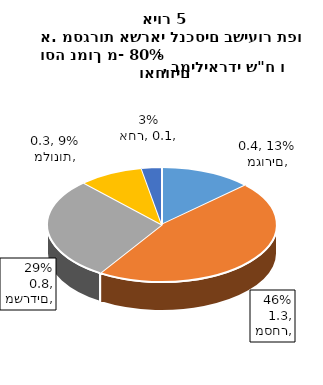
| Category | Series 0 |
|---|---|
| מגורים | 0.381 |
| מסחר | 1.349 |
| משרדים | 0.85 |
| מלונות | 0.267 |
| אחר | 0.084 |